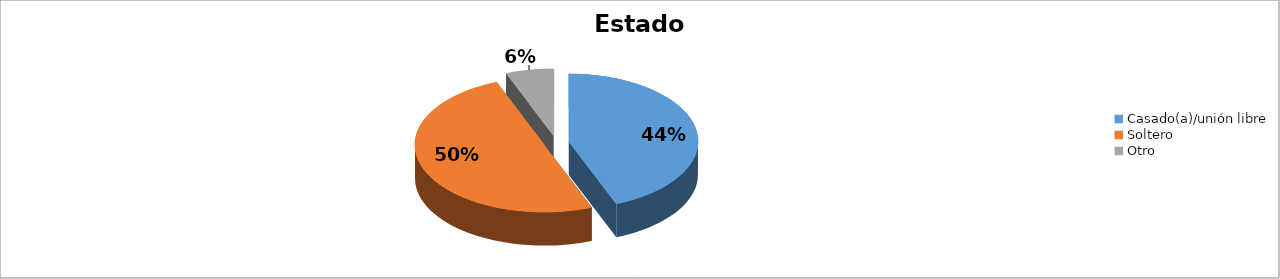
| Category | Series 0 |
|---|---|
| Casado(a)/unión libre | 0.44 |
| Soltero | 0.5 |
| Otro | 0.06 |